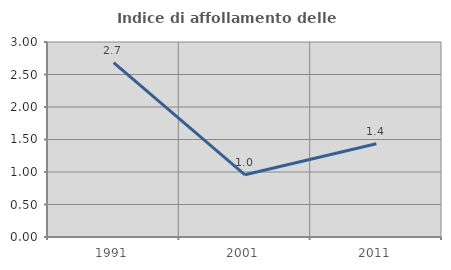
| Category | Indice di affollamento delle abitazioni  |
|---|---|
| 1991.0 | 2.683 |
| 2001.0 | 0.957 |
| 2011.0 | 1.435 |